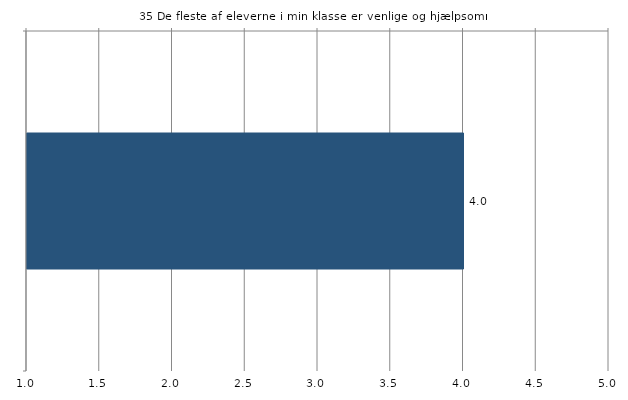
| Category | Gns. |
|---|---|
|   | 4 |